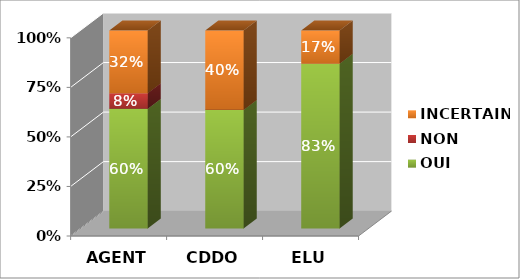
| Category | OUI | NON | INCERTAIN |
|---|---|---|---|
| AGENT | 0.604 | 0.079 | 0.317 |
| CDDO | 0.6 | 0 | 0.4 |
| ELU | 0.833 | 0 | 0.167 |